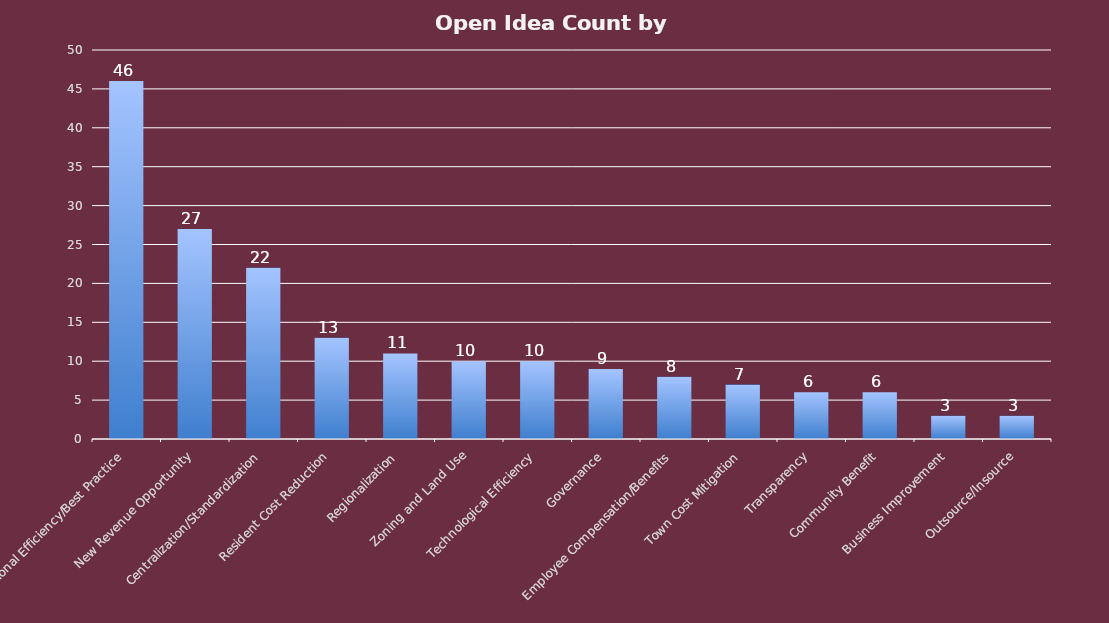
| Category | Total |
|---|---|
| Operational Efficiency/Best Practice | 46 |
| New Revenue Opportunity | 27 |
| Centralization/Standardization | 22 |
| Resident Cost Reduction | 13 |
| Regionalization | 11 |
| Zoning and Land Use | 10 |
| Technological Efficiency | 10 |
| Governance | 9 |
| Employee Compensation/Benefits | 8 |
| Town Cost Mitigation | 7 |
| Transparency | 6 |
| Community Benefit | 6 |
| Business Improvement | 3 |
| Outsource/Insource | 3 |